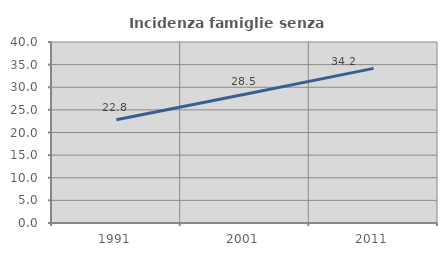
| Category | Incidenza famiglie senza nuclei |
|---|---|
| 1991.0 | 22.838 |
| 2001.0 | 28.462 |
| 2011.0 | 34.165 |